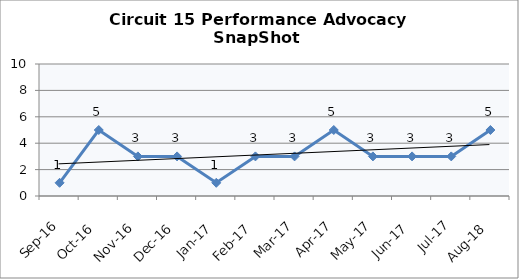
| Category | Circuit 15 |
|---|---|
| Sep-16 | 1 |
| Oct-16 | 5 |
| Nov-16 | 3 |
| Dec-16 | 3 |
| Jan-17 | 1 |
| Feb-17 | 3 |
| Mar-17 | 3 |
| Apr-17 | 5 |
| May-17 | 3 |
| Jun-17 | 3 |
| Jul-17 | 3 |
| Aug-18 | 5 |